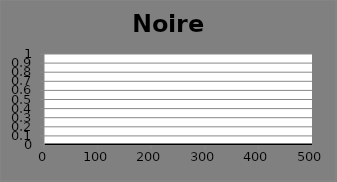
| Category | Noire Cum |
|---|---|
| 0 | 0 |
| 1 | 0 |
| 2 | 0 |
| 3 | 0 |
| 4 | 0 |
| 5 | 0 |
| 6 | 0 |
| 7 | 0 |
| 8 | 0 |
| 9 | 0 |
| 10 | 0 |
| 11 | 0 |
| 12 | 0 |
| 13 | 0 |
| 14 | 0 |
| 15 | 0 |
| 16 | 0 |
| 17 | 0 |
| 18 | 0 |
| 19 | 0 |
| 20 | 0 |
| 21 | 0 |
| 22 | 0 |
| 23 | 0 |
| 24 | 0 |
| 25 | 0 |
| 26 | 0 |
| 27 | 0 |
| 28 | 0 |
| 29 | 0 |
| 30 | 0 |
| 31 | 0 |
| 32 | 0 |
| 33 | 0 |
| 34 | 0 |
| 35 | 0 |
| 36 | 0 |
| 37 | 0 |
| 38 | 0 |
| 39 | 0 |
| 40 | 0 |
| 41 | 0 |
| 42 | 0 |
| 43 | 0 |
| 44 | 0 |
| 45 | 0 |
| 46 | 0 |
| 47 | 0 |
| 48 | 0 |
| 49 | 0 |
| 50 | 0 |
| 51 | 0 |
| 52 | 0 |
| 53 | 0 |
| 54 | 0 |
| 55 | 0 |
| 56 | 0 |
| 57 | 0 |
| 58 | 0 |
| 59 | 0 |
| 60 | 0 |
| 61 | 0 |
| 62 | 0 |
| 63 | 0 |
| 64 | 0 |
| 65 | 0 |
| 66 | 0 |
| 67 | 0 |
| 68 | 0 |
| 69 | 0 |
| 70 | 0 |
| 71 | 0 |
| 72 | 0 |
| 73 | 0 |
| 74 | 0 |
| 75 | 0 |
| 76 | 0 |
| 77 | 0 |
| 78 | 0 |
| 79 | 0 |
| 80 | 0 |
| 81 | 0 |
| 82 | 0 |
| 83 | 0 |
| 84 | 0 |
| 85 | 0 |
| 86 | 0 |
| 87 | 0 |
| 88 | 0 |
| 89 | 0 |
| 90 | 0 |
| 91 | 0 |
| 92 | 0 |
| 93 | 0 |
| 94 | 0 |
| 95 | 0 |
| 96 | 0 |
| 97 | 0 |
| 98 | 0 |
| 99 | 0 |
| 100 | 0 |
| 101 | 0 |
| 102 | 0 |
| 103 | 0 |
| 104 | 0 |
| 105 | 0 |
| 106 | 0 |
| 107 | 0 |
| 108 | 0 |
| 109 | 0 |
| 110 | 0 |
| 111 | 0 |
| 112 | 0 |
| 113 | 0 |
| 114 | 0 |
| 115 | 0 |
| 116 | 0 |
| 117 | 0 |
| 118 | 0 |
| 119 | 0 |
| 120 | 0 |
| 121 | 0 |
| 122 | 0 |
| 123 | 0 |
| 124 | 0 |
| 125 | 0 |
| 126 | 0 |
| 127 | 0 |
| 128 | 0 |
| 129 | 0 |
| 130 | 0 |
| 131 | 0 |
| 132 | 0 |
| 133 | 0 |
| 134 | 0 |
| 135 | 0 |
| 136 | 0 |
| 137 | 0 |
| 138 | 0 |
| 139 | 0 |
| 140 | 0 |
| 141 | 0 |
| 142 | 0 |
| 143 | 0 |
| 144 | 0 |
| 145 | 0 |
| 146 | 0 |
| 147 | 0 |
| 148 | 0 |
| 149 | 0 |
| 150 | 0 |
| 151 | 0 |
| 152 | 0 |
| 153 | 0 |
| 154 | 0 |
| 155 | 0 |
| 156 | 0 |
| 157 | 0 |
| 158 | 0 |
| 159 | 0 |
| 160 | 0 |
| 161 | 0 |
| 162 | 0 |
| 163 | 0 |
| 164 | 0 |
| 165 | 0 |
| 166 | 0 |
| 167 | 0 |
| 168 | 0 |
| 169 | 0 |
| 170 | 0 |
| 171 | 0 |
| 172 | 0 |
| 173 | 0 |
| 174 | 0 |
| 175 | 0 |
| 176 | 0 |
| 177 | 0 |
| 178 | 0 |
| 179 | 0 |
| 180 | 0 |
| 181 | 0 |
| 182 | 0 |
| 183 | 0 |
| 184 | 0 |
| 185 | 0 |
| 186 | 0 |
| 187 | 0 |
| 188 | 0 |
| 189 | 0 |
| 190 | 0 |
| 191 | 0 |
| 192 | 0 |
| 193 | 0 |
| 194 | 0 |
| 195 | 0 |
| 196 | 0 |
| 197 | 0 |
| 198 | 0 |
| 199 | 0 |
| 200 | 0 |
| 201 | 0 |
| 202 | 0 |
| 203 | 0 |
| 204 | 0 |
| 205 | 0 |
| 206 | 0 |
| 207 | 0 |
| 208 | 0 |
| 209 | 0 |
| 210 | 0 |
| 211 | 0 |
| 212 | 0 |
| 213 | 0 |
| 214 | 0 |
| 215 | 0 |
| 216 | 0 |
| 217 | 0 |
| 218 | 0 |
| 219 | 0 |
| 220 | 0 |
| 221 | 0 |
| 222 | 0 |
| 223 | 0 |
| 224 | 0 |
| 225 | 0 |
| 226 | 0 |
| 227 | 0 |
| 228 | 0 |
| 229 | 0 |
| 230 | 0 |
| 231 | 0 |
| 232 | 0 |
| 233 | 0 |
| 234 | 0 |
| 235 | 0 |
| 236 | 0 |
| 237 | 0 |
| 238 | 0 |
| 239 | 0 |
| 240 | 0 |
| 241 | 0 |
| 242 | 0 |
| 243 | 0 |
| 244 | 0 |
| 245 | 0 |
| 246 | 0 |
| 247 | 0 |
| 248 | 0 |
| 249 | 0 |
| 250 | 0 |
| 251 | 0 |
| 252 | 0 |
| 253 | 0 |
| 254 | 0 |
| 255 | 0 |
| 256 | 0 |
| 257 | 0 |
| 258 | 0 |
| 259 | 0 |
| 260 | 0 |
| 261 | 0 |
| 262 | 0 |
| 263 | 0 |
| 264 | 0 |
| 265 | 0 |
| 266 | 0 |
| 267 | 0 |
| 268 | 0 |
| 269 | 0 |
| 270 | 0 |
| 271 | 0 |
| 272 | 0 |
| 273 | 0 |
| 274 | 0 |
| 275 | 0 |
| 276 | 0 |
| 277 | 0 |
| 278 | 0 |
| 279 | 0 |
| 280 | 0 |
| 281 | 0 |
| 282 | 0 |
| 283 | 0 |
| 284 | 0 |
| 285 | 0 |
| 286 | 0 |
| 287 | 0 |
| 288 | 0 |
| 289 | 0 |
| 290 | 0 |
| 291 | 0 |
| 292 | 0 |
| 293 | 0 |
| 294 | 0 |
| 295 | 0 |
| 296 | 0 |
| 297 | 0 |
| 298 | 0 |
| 299 | 0 |
| 300 | 0 |
| 301 | 0 |
| 302 | 0 |
| 303 | 0 |
| 304 | 0 |
| 305 | 0 |
| 306 | 0 |
| 307 | 0 |
| 308 | 0 |
| 309 | 0 |
| 310 | 0 |
| 311 | 0 |
| 312 | 0 |
| 313 | 0 |
| 314 | 0 |
| 315 | 0 |
| 316 | 0 |
| 317 | 0 |
| 318 | 0 |
| 319 | 0 |
| 320 | 0 |
| 321 | 0 |
| 322 | 0 |
| 323 | 0 |
| 324 | 0 |
| 325 | 0 |
| 326 | 0 |
| 327 | 0 |
| 328 | 0 |
| 329 | 0 |
| 330 | 0 |
| 331 | 0 |
| 332 | 0 |
| 333 | 0 |
| 334 | 0 |
| 335 | 0 |
| 336 | 0 |
| 337 | 0 |
| 338 | 0 |
| 339 | 0 |
| 340 | 0 |
| 341 | 0 |
| 342 | 0 |
| 343 | 0 |
| 344 | 0 |
| 345 | 0 |
| 346 | 0 |
| 347 | 0 |
| 348 | 0 |
| 349 | 0 |
| 350 | 0 |
| 351 | 0 |
| 352 | 0 |
| 353 | 0 |
| 354 | 0 |
| 355 | 0 |
| 356 | 0 |
| 357 | 0 |
| 358 | 0 |
| 359 | 0 |
| 360 | 0 |
| 361 | 0 |
| 362 | 0 |
| 363 | 0 |
| 364 | 0 |
| 365 | 0 |
| 366 | 0 |
| 367 | 0 |
| 368 | 0 |
| 369 | 0 |
| 370 | 0 |
| 371 | 0 |
| 372 | 0 |
| 373 | 0 |
| 374 | 0 |
| 375 | 0 |
| 376 | 0 |
| 377 | 0 |
| 378 | 0 |
| 379 | 0 |
| 380 | 0 |
| 381 | 0 |
| 382 | 0 |
| 383 | 0 |
| 384 | 0 |
| 385 | 0 |
| 386 | 0 |
| 387 | 0 |
| 388 | 0 |
| 389 | 0 |
| 390 | 0 |
| 391 | 0 |
| 392 | 0 |
| 393 | 0 |
| 394 | 0 |
| 395 | 0 |
| 396 | 0 |
| 397 | 0 |
| 398 | 0 |
| 399 | 0 |
| 400 | 0 |
| 401 | 0 |
| 402 | 0 |
| 403 | 0 |
| 404 | 0 |
| 405 | 0 |
| 406 | 0 |
| 407 | 0 |
| 408 | 0 |
| 409 | 0 |
| 410 | 0 |
| 411 | 0 |
| 412 | 0 |
| 413 | 0 |
| 414 | 0 |
| 415 | 0 |
| 416 | 0 |
| 417 | 0 |
| 418 | 0 |
| 419 | 0 |
| 420 | 0 |
| 421 | 0 |
| 422 | 0 |
| 423 | 0 |
| 424 | 0 |
| 425 | 0 |
| 426 | 0 |
| 427 | 0 |
| 428 | 0 |
| 429 | 0 |
| 430 | 0 |
| 431 | 0 |
| 432 | 0 |
| 433 | 0 |
| 434 | 0 |
| 435 | 0 |
| 436 | 0 |
| 437 | 0 |
| 438 | 0 |
| 439 | 0 |
| 440 | 0 |
| 441 | 0 |
| 442 | 0 |
| 443 | 0 |
| 444 | 0 |
| 445 | 0 |
| 446 | 0 |
| 447 | 0 |
| 448 | 0 |
| 449 | 0 |
| 450 | 0 |
| 451 | 0 |
| 452 | 0 |
| 453 | 0 |
| 454 | 0 |
| 455 | 0 |
| 456 | 0 |
| 457 | 0 |
| 458 | 0 |
| 459 | 0 |
| 460 | 0 |
| 461 | 0 |
| 462 | 0 |
| 463 | 0 |
| 464 | 0 |
| 465 | 0 |
| 466 | 0 |
| 467 | 0 |
| 468 | 0 |
| 469 | 0 |
| 470 | 0 |
| 471 | 0 |
| 472 | 0 |
| 473 | 0 |
| 474 | 0 |
| 475 | 0 |
| 476 | 0 |
| 477 | 0 |
| 478 | 0 |
| 479 | 0 |
| 480 | 0 |
| 481 | 0 |
| 482 | 0 |
| 483 | 0 |
| 484 | 0 |
| 485 | 0 |
| 486 | 0 |
| 487 | 0 |
| 488 | 0 |
| 489 | 0 |
| 490 | 0 |
| 491 | 0 |
| 492 | 0 |
| 493 | 0 |
| 494 | 0 |
| 495 | 0 |
| 496 | 0 |
| 497 | 0 |
| 498 | 0 |
| 499 | 0 |